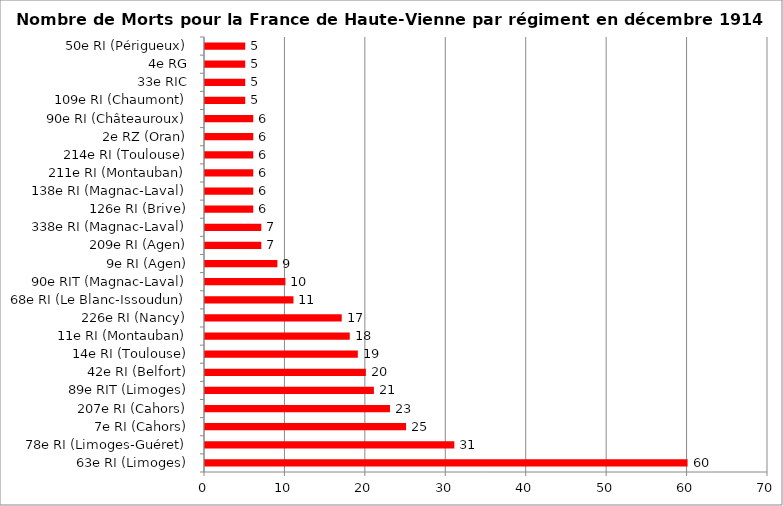
| Category | Nombre de Morts pour la France de Haute-Vienne par régiment en décembre 1914 |
|---|---|
| 63e RI (Limoges) | 60 |
| 78e RI (Limoges-Guéret) | 31 |
| 7e RI (Cahors) | 25 |
| 207e RI (Cahors) | 23 |
| 89e RIT (Limoges) | 21 |
| 42e RI (Belfort) | 20 |
| 14e RI (Toulouse) | 19 |
| 11e RI (Montauban) | 18 |
| 226e RI (Nancy) | 17 |
| 68e RI (Le Blanc-Issoudun) | 11 |
| 90e RIT (Magnac-Laval) | 10 |
| 9e RI (Agen) | 9 |
| 209e RI (Agen) | 7 |
| 338e RI (Magnac-Laval) | 7 |
| 126e RI (Brive) | 6 |
| 138e RI (Magnac-Laval) | 6 |
| 211e RI (Montauban) | 6 |
| 214e RI (Toulouse) | 6 |
| 2e RZ (Oran) | 6 |
| 90e RI (Châteauroux) | 6 |
| 109e RI (Chaumont) | 5 |
| 33e RIC | 5 |
| 4e RG | 5 |
| 50e RI (Périgueux) | 5 |